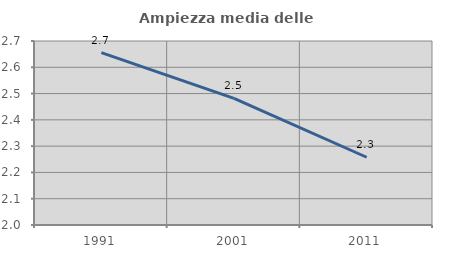
| Category | Ampiezza media delle famiglie |
|---|---|
| 1991.0 | 2.655 |
| 2001.0 | 2.482 |
| 2011.0 | 2.258 |